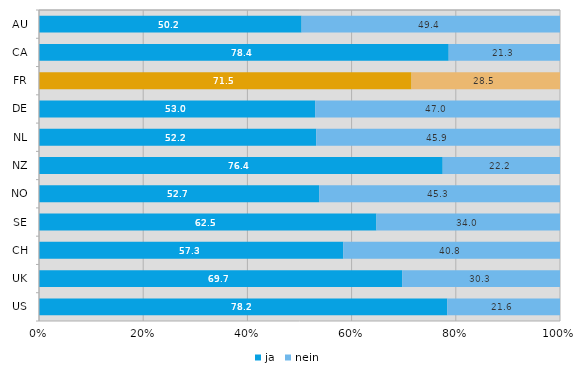
| Category | ja | nein |
|---|---|---|
| AU | 50.2 | 49.4 |
| CA | 78.4 | 21.3 |
| FR | 71.5 | 28.5 |
| DE | 53 | 47 |
| NL | 52.2 | 45.9 |
| NZ | 76.4 | 22.2 |
| NO | 52.7 | 45.3 |
| SE | 62.5 | 34 |
| CH | 57.3 | 40.8 |
| UK | 69.7 | 30.3 |
| US | 78.2 | 21.6 |